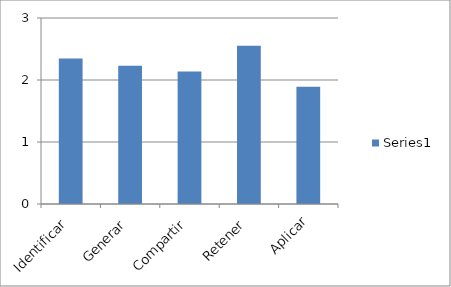
| Category | Series 0 |
|---|---|
| Identificar | 2.349 |
| Generar | 2.229 |
| Compartir | 2.138 |
| Retener | 2.55 |
| Aplicar | 1.89 |